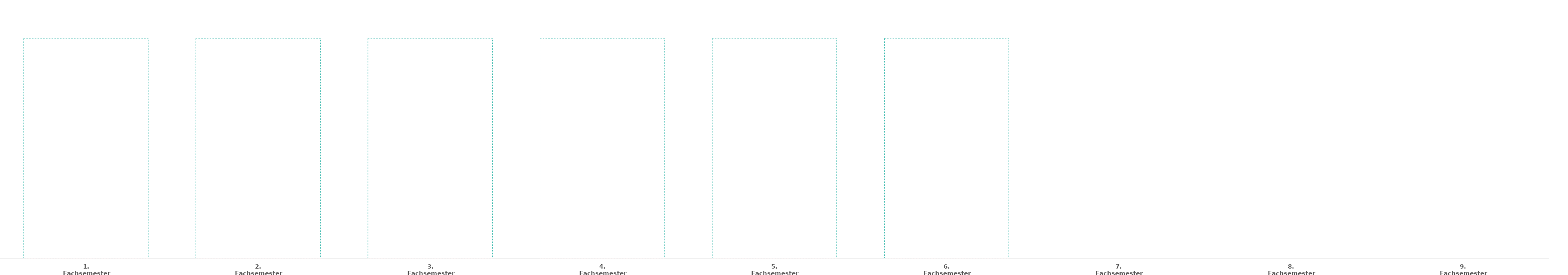
| Category | Modul 1 | Modul 2 | Modul 3 | Modul 4 | Modul 5 | Modul 6 | Modul 7 | Modul 8 | Modul 9 | Seminar | Berufspraktikum | Bachelorarbeit | Soll-ECTS |
|---|---|---|---|---|---|---|---|---|---|---|---|---|---|
| 1. Fachsemester | 0 | 0 | 0 | 0 | 0 | 0 | 0 | 0 | 0 | 0 | 0 | 0 | 30 |
| 2. Fachsemester | 0 | 0 | 0 | 0 | 0 | 0 | 0 | 0 | 0 | 0 | 0 | 0 | 30 |
| 3. Fachsemester | 0 | 0 | 0 | 0 | 0 | 0 | 0 | 0 | 0 | 0 | 0 | 0 | 30 |
| 4. Fachsemester | 0 | 0 | 0 | 0 | 0 | 0 | 0 | 0 | 0 | 0 | 0 | 0 | 30 |
| 5. Fachsemester | 0 | 0 | 0 | 0 | 0 | 0 | 0 | 0 | 0 | 0 | 0 | 0 | 30 |
| 6. Fachsemester | 0 | 0 | 0 | 0 | 0 | 0 | 0 | 0 | 0 | 0 | 0 | 0 | 30 |
| 7. Fachsemester | 0 | 0 | 0 | 0 | 0 | 0 | 0 | 0 | 0 | 0 | 0 | 0 | 0 |
| 8. Fachsemester | 0 | 0 | 0 | 0 | 0 | 0 | 0 | 0 | 0 | 0 | 0 | 0 | 0 |
| 9. Fachsemester | 0 | 0 | 0 | 0 | 0 | 0 | 0 | 0 | 0 | 0 | 0 | 0 | 0 |